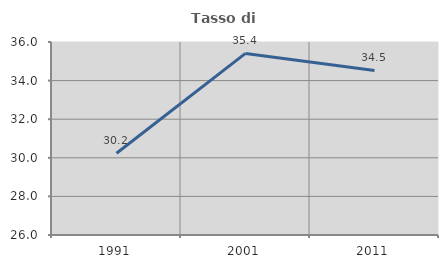
| Category | Tasso di occupazione   |
|---|---|
| 1991.0 | 30.238 |
| 2001.0 | 35.41 |
| 2011.0 | 34.528 |